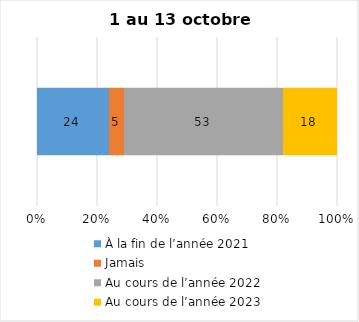
| Category | À la fin de l’année 2021 | Jamais | Au cours de l’année 2022 | Au cours de l’année 2023 |
|---|---|---|---|---|
| 0 | 24 | 5 | 53 | 18 |